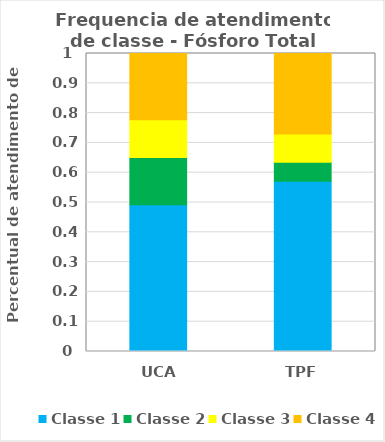
| Category | Classe 1 | Classe 2 | Classe 3 | Classe 4 |
|---|---|---|---|---|
| UCA | 0.492 | 0.159 | 0.127 | 0.222 |
| TPF | 0.571 | 0.063 | 0.095 | 0.27 |